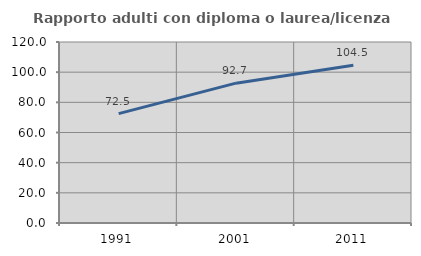
| Category | Rapporto adulti con diploma o laurea/licenza media  |
|---|---|
| 1991.0 | 72.499 |
| 2001.0 | 92.713 |
| 2011.0 | 104.542 |